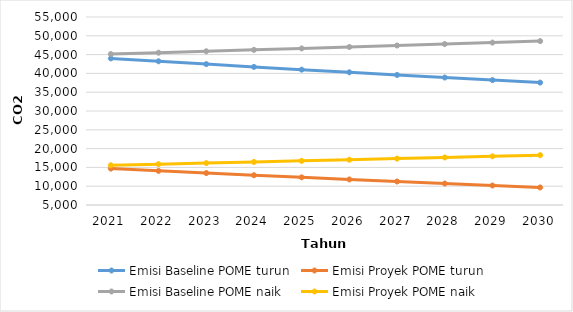
| Category | Emisi Baseline POME turun | Emisi Proyek POME turun | Emisi Baseline POME naik | Emisi Proyek POME naik |
|---|---|---|---|---|
| 2021.0 | 43988.054 | 14675.046 | 45135.93 | 15568.661 |
| 2022.0 | 43221.89 | 14078.593 | 45507.088 | 15857.605 |
| 2023.0 | 42469.071 | 13492.528 | 45881.298 | 16148.926 |
| 2024.0 | 41729.365 | 12916.671 | 46258.586 | 16442.642 |
| 2025.0 | 41002.542 | 12350.844 | 46638.976 | 16738.773 |
| 2026.0 | 40288.379 | 11794.872 | 47022.494 | 17037.34 |
| 2027.0 | 39586.654 | 11248.584 | 47409.166 | 17338.361 |
| 2028.0 | 38897.152 | 10711.811 | 47799.018 | 17641.858 |
| 2029.0 | 38219.66 | 10184.387 | 48192.075 | 17947.851 |
| 2030.0 | 37553.967 | 9666.149 | 48588.364 | 18256.36 |